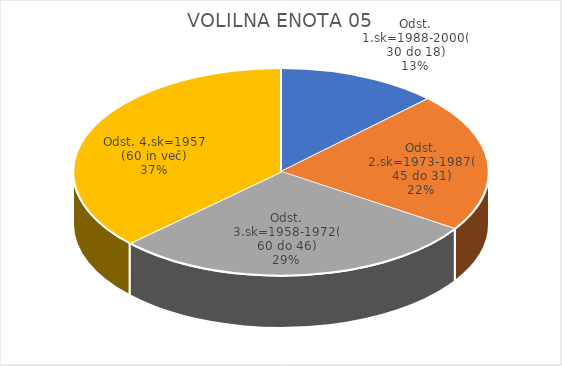
| Category | VOLILNA ENOTA 05 |
|---|---|
| Odst. 1.sk=1988-2000(30 do 18) | 6.69 |
| Odst. 2.sk=1973-1987(45 do 31) | 11.58 |
| Odst. 3.sk=1958-1972(60 do 46) | 15.3 |
| Odst. 4.sk=1957 (60 in več) | 19.76 |